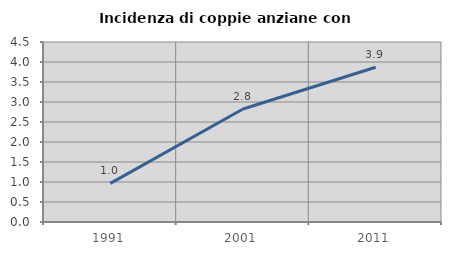
| Category | Incidenza di coppie anziane con figli |
|---|---|
| 1991.0 | 0.965 |
| 2001.0 | 2.826 |
| 2011.0 | 3.868 |